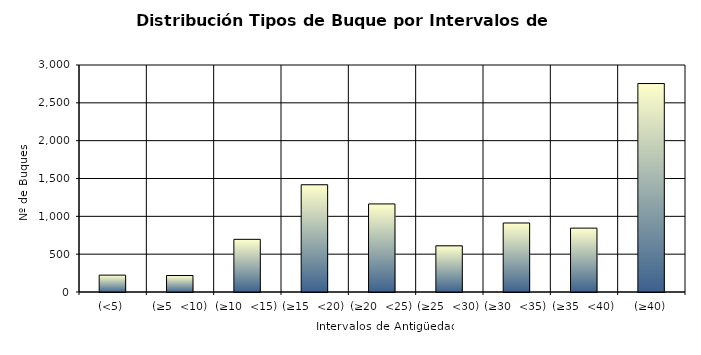
| Category | Series 0 |
|---|---|
| (<5) | 223 |
| (≥5  <10) | 218 |
| (≥10  <15) | 696 |
| (≥15  <20) | 1417 |
| (≥20  <25) | 1164 |
| (≥25  <30) | 610 |
| (≥30  <35) | 912 |
| (≥35  <40) | 844 |
| (≥40) | 2755 |